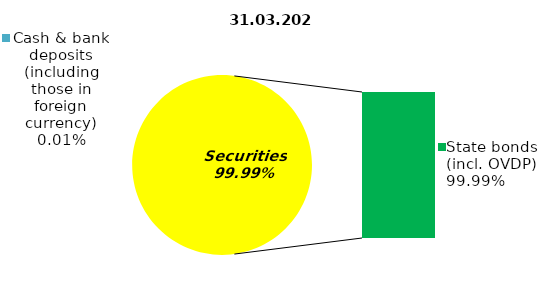
| Category | Series 0 |
|---|---|
| Cash & bank deposits (including those in foreign currency) | 0.01 |
| Bank metals | 0 |
| Real estate | 0 |
| Other assets | 0 |
| Equities | 0 |
| Corporate bonds | 0 |
| Municipal bonds | 0 |
| State bonds (incl. OVDP) | 131.14 |
| Mortgage notes | 0 |